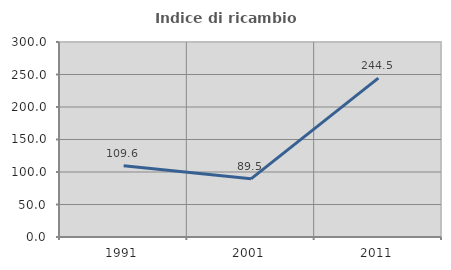
| Category | Indice di ricambio occupazionale  |
|---|---|
| 1991.0 | 109.611 |
| 2001.0 | 89.485 |
| 2011.0 | 244.483 |